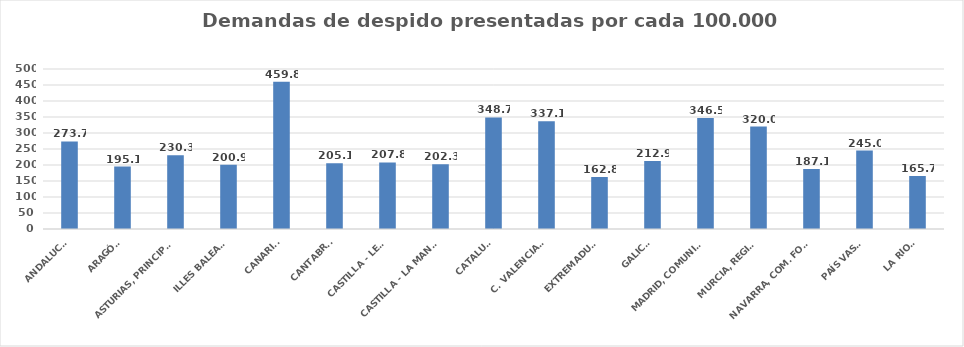
| Category | Series 0 |
|---|---|
| ANDALUCÍA | 273.672 |
| ARAGÓN | 195.06 |
| ASTURIAS, PRINCIPADO | 230.279 |
| ILLES BALEARS | 200.874 |
| CANARIAS | 459.848 |
| CANTABRIA | 205.088 |
| CASTILLA - LEÓN | 207.844 |
| CASTILLA - LA MANCHA | 202.343 |
| CATALUÑA | 348.738 |
| C. VALENCIANA | 337.085 |
| EXTREMADURA | 162.761 |
| GALICIA | 212.874 |
| MADRID, COMUNIDAD | 346.535 |
| MURCIA, REGIÓN | 319.962 |
| NAVARRA, COM. FORAL | 187.147 |
| PAÍS VASCO | 244.965 |
| LA RIOJA | 165.703 |